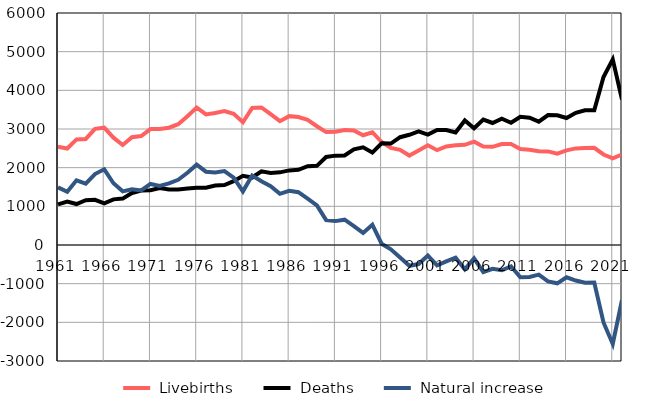
| Category |  Livebirths |  Deaths |  Natural increase |
|---|---|---|---|
| 1961.0 | 2539 | 1050 | 1489 |
| 1962.0 | 2496 | 1121 | 1375 |
| 1963.0 | 2731 | 1059 | 1672 |
| 1964.0 | 2743 | 1157 | 1586 |
| 1965.0 | 3003 | 1167 | 1836 |
| 1966.0 | 3033 | 1076 | 1957 |
| 1967.0 | 2776 | 1180 | 1596 |
| 1968.0 | 2587 | 1200 | 1387 |
| 1969.0 | 2789 | 1346 | 1443 |
| 1970.0 | 2817 | 1407 | 1410 |
| 1971.0 | 2997 | 1418 | 1579 |
| 1972.0 | 2999 | 1474 | 1525 |
| 1973.0 | 3033 | 1438 | 1595 |
| 1974.0 | 3124 | 1438 | 1686 |
| 1975.0 | 3331 | 1462 | 1869 |
| 1976.0 | 3556 | 1479 | 2077 |
| 1977.0 | 3376 | 1480 | 1896 |
| 1978.0 | 3415 | 1538 | 1877 |
| 1979.0 | 3463 | 1550 | 1913 |
| 1980.0 | 3392 | 1650 | 1742 |
| 1981.0 | 3175 | 1788 | 1387 |
| 1982.0 | 3543 | 1745 | 1798 |
| 1983.0 | 3557 | 1906 | 1651 |
| 1984.0 | 3382 | 1861 | 1521 |
| 1985.0 | 3202 | 1879 | 1323 |
| 1986.0 | 3332 | 1929 | 1403 |
| 1987.0 | 3309 | 1943 | 1366 |
| 1988.0 | 3238 | 2039 | 1199 |
| 1989.0 | 3072 | 2047 | 1025 |
| 1990.0 | 2920 | 2276 | 644 |
| 1991.0 | 2929 | 2311 | 618 |
| 1992.0 | 2971 | 2317 | 654 |
| 1993.0 | 2963 | 2473 | 490 |
| 1994.0 | 2839 | 2527 | 312 |
| 1995.0 | 2916 | 2390 | 526 |
| 1996.0 | 2663 | 2630 | 33 |
| 1997.0 | 2512 | 2623 | -111 |
| 1998.0 | 2462 | 2788 | -326 |
| 1999.0 | 2313 | 2851 | -538 |
| 2000.0 | 2443 | 2936 | -493 |
| 2001.0 | 2579 | 2854 | -275 |
| 2002.0 | 2453 | 2977 | -524 |
| 2003.0 | 2550 | 2973 | -423 |
| 2004.0 | 2582 | 2910 | -328 |
| 2005.0 | 2591 | 3221 | -630 |
| 2006.0 | 2672 | 3018 | -346 |
| 2007.0 | 2544 | 3244 | -700 |
| 2008.0 | 2539 | 3156 | -617 |
| 2009.0 | 2612 | 3266 | -654 |
| 2010.0 | 2611 | 3162 | -551 |
| 2011.0 | 2482 | 3316 | -834 |
| 2012.0 | 2465 | 3291 | -826 |
| 2013.0 | 2423 | 3190 | -767 |
| 2014.0 | 2420 | 3362 | -942 |
| 2015.0 | 2364 | 3355 | -991 |
| 2016.0 | 2448 | 3284 | -836 |
| 2017.0 | 2498 | 3417 | -919 |
| 2018.0 | 2510 | 3484 | -974 |
| 2019.0 | 2514 | 3485 | -971 |
| 2020.0 | 2341 | 4344 | -2003 |
| 2021.0 | 2241 | 4801 | -2560 |
| 2022.0 | 2340 | 3763 | -1423 |